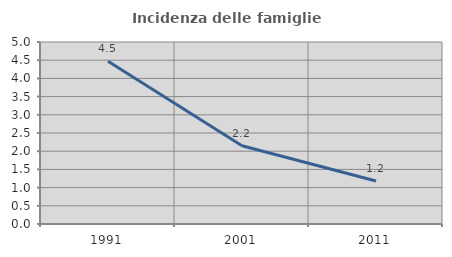
| Category | Incidenza delle famiglie numerose |
|---|---|
| 1991.0 | 4.469 |
| 2001.0 | 2.151 |
| 2011.0 | 1.182 |